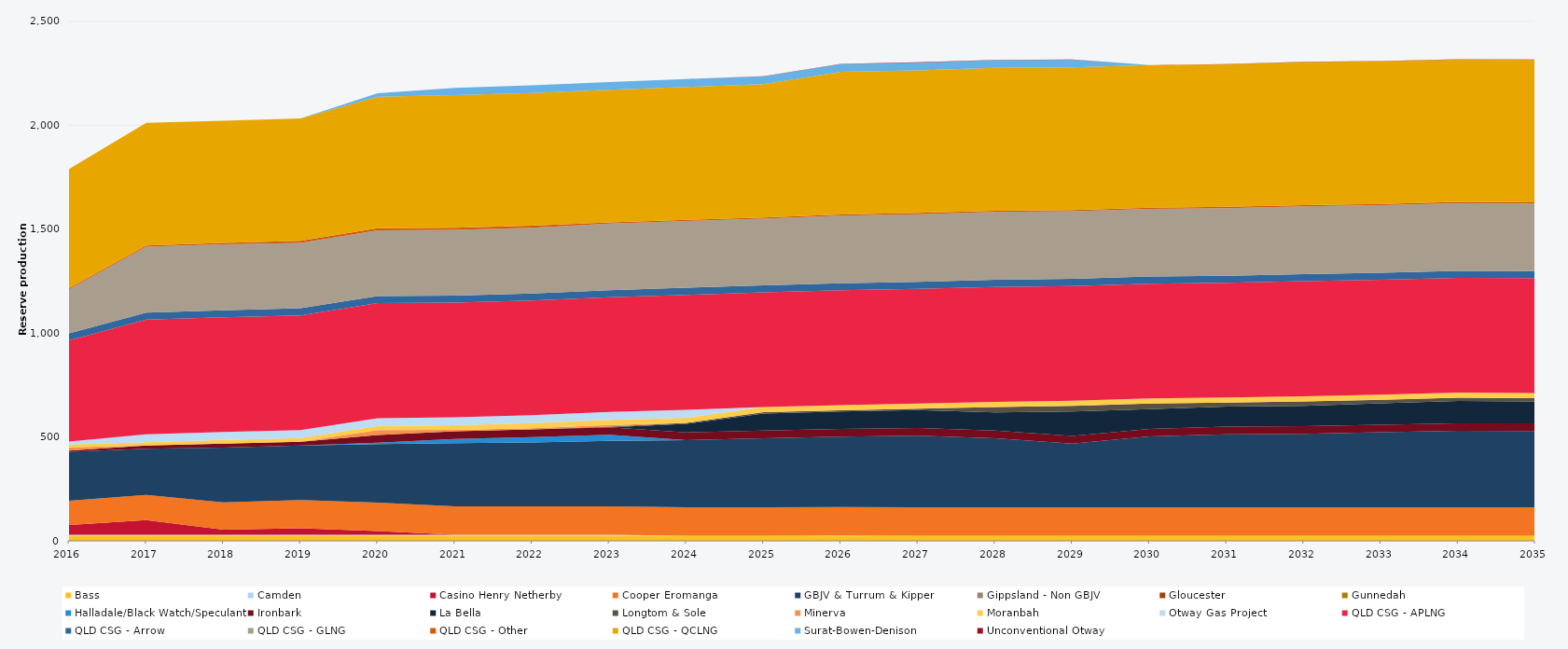
| Category | Bass | Camden | Casino Henry Netherby | Cooper Eromanga | GBJV & Turrum & Kipper | Gippsland - Non GBJV | Gloucester | Gunnedah | Halladale/Black Watch/Speculant | Ironbark | La Bella | Longtom & Sole | Minerva | Moranbah | Otway Gas Project | QLD CSG - APLNG | QLD CSG - Arrow | QLD CSG - GLNG | QLD CSG - Other | QLD CSG - QCLNG | Surat-Bowen-Denison | Unconventional Otway |
|---|---|---|---|---|---|---|---|---|---|---|---|---|---|---|---|---|---|---|---|---|---|---|
| 2016 | 24.522 | 5 | 46.481 | 117.302 | 235.041 | 0 | 0 | 0 | 0 | 5.468 | 0 | 0 | 16 | 13.144 | 15.606 | 486.482 | 34.038 | 211.563 | 5.856 | 573.742 | 0 | 0 |
| 2017 | 24.455 | 5 | 69.931 | 121.253 | 222.562 | 0 | 0 | 0 | 0 | 16.286 | 0 | 0 | 0 | 14.794 | 38 | 552.245 | 33.945 | 317.522 | 5.84 | 589.569 | 0 | 0 |
| 2018 | 24.455 | 5 | 24.61 | 130.904 | 264.315 | 0 | 0 | 0 | 0 | 18.209 | 0 | 0 | 0 | 17.995 | 38 | 552.245 | 33.945 | 318.073 | 5.84 | 588.744 | 0 | 0 |
| 2019 | 24.455 | 5 | 31.568 | 135.35 | 262.5 | 0 | 0 | 0 | 0 | 18.25 | 0 | 0 | 0 | 18.062 | 38 | 552.245 | 33.945 | 314.436 | 10.403 | 588.948 | 0 | 0 |
| 2020 | 24.522 | 5 | 17.669 | 137.25 | 281.351 | 0 | 0 | 0 | 6.818 | 36.6 | 0 | 0 | 23.79 | 19.632 | 38 | 553.758 | 34.038 | 315.784 | 10.419 | 633.458 | 16.42 | 0 |
| 2021 | 24.455 | 5 | 0 | 136.875 | 304.277 | 0 | 0 | 0 | 20.198 | 36.5 | 0 | 0 | 7.135 | 22.187 | 38 | 552.245 | 33.945 | 315.98 | 10.403 | 638.374 | 35.153 | 0 |
| 2022 | 24.455 | 5 | 0 | 136.875 | 306.648 | 0 | 0 | 0 | 26.339 | 36.5 | 0 | 0 | 6.283 | 24.144 | 38 | 552.245 | 33.945 | 316.418 | 10.403 | 638.383 | 37.23 | 0 |
| 2023 | 24.455 | 5 | 0 | 136.875 | 315.098 | 0 | 0 | 0 | 28.645 | 36.5 | 0 | 3.364 | 7.541 | 24.788 | 38 | 552.245 | 33.945 | 320.75 | 5.84 | 638.041 | 37.23 | 0 |
| 2024 | 24.522 | 0 | 0 | 137.25 | 323.245 | 0 | 0 | 0 | 0 | 36.6 | 42.142 | 3.84 | 0 | 24.888 | 38 | 553.758 | 34.038 | 321.243 | 5.856 | 639.813 | 37.332 | 0 |
| 2025 | 24.455 | 0 | 0 | 136.875 | 332.757 | 0 | 0 | 0 | 0 | 36.5 | 82.203 | 6.262 | 0 | 24.82 | 0 | 552.245 | 33.945 | 320.866 | 5.84 | 641.133 | 37.23 | 0.854 |
| 2026 | 24.455 | 1 | 0 | 136.875 | 339.537 | 0 | 0 | 0 | 0 | 36.5 | 84.04 | 6.381 | 0 | 24.82 | 0 | 552.245 | 33.945 | 325.58 | 5.84 | 686.2 | 37.23 | 0.883 |
| 2027 | 24.455 | 0 | 0 | 136.875 | 345.189 | 0 | 0 | 0 | 0 | 36.5 | 86.031 | 6.937 | 0 | 24.82 | 0 | 552.245 | 33.945 | 325.58 | 5.84 | 686.2 | 37.23 | 1.497 |
| 2028 | 24.522 | 0 | 0 | 137.25 | 332.301 | 0 | 0 | 0 | 0 | 36.6 | 88.107 | 24.931 | 0 | 24.888 | 0 | 553.758 | 34.038 | 326.472 | 5.856 | 688.08 | 37.332 | 0.878 |
| 2029 | 24.455 | 0 | 0 | 136.875 | 306.869 | 0 | 0 | 0 | 0 | 36.5 | 117.776 | 27.375 | 0 | 24.82 | 0 | 552.245 | 33.945 | 325.58 | 5.84 | 686.2 | 37.127 | 1.495 |
| 2030 | 24.455 | 0 | 0 | 136.875 | 341.19 | 0 | 0 | 0 | 0 | 36.5 | 94.742 | 27.375 | 0 | 24.82 | 0 | 552.245 | 33.945 | 325.58 | 5.84 | 686.2 | 0 | 0.507 |
| 2031 | 24.455 | 0 | 0 | 136.875 | 351.891 | 0 | 0 | 0 | 0 | 36.5 | 96.446 | 18.956 | 0 | 24.82 | 0 | 552.245 | 33.945 | 325.58 | 5.84 | 686.2 | 0 | 0.41 |
| 2032 | 24.522 | 0 | 0 | 137.25 | 353.692 | 0 | 0 | 0 | 0 | 36.6 | 98.152 | 21.12 | 0 | 24.888 | 0 | 553.758 | 34.038 | 326.472 | 5.856 | 688.08 | 0 | 1.258 |
| 2033 | 24.455 | 0 | 0 | 136.875 | 361.413 | 0 | 0 | 0 | 0 | 36.5 | 103.278 | 16.645 | 0 | 24.82 | 0 | 552.245 | 33.945 | 325.58 | 5.84 | 686.2 | 0 | 0.957 |
| 2034 | 24.455 | 0 | 0 | 136.875 | 368.025 | 0 | 0 | 0 | 0 | 36.5 | 107.761 | 15.064 | 0 | 24.82 | 0 | 552.245 | 33.945 | 325.58 | 5.84 | 686.2 | 0 | 1.243 |
| 2035 | 24.455 | 0 | 0 | 136.875 | 367.134 | 0 | 0 | 0 | 0 | 36.5 | 106.322 | 15.791 | 0 | 24.82 | 0 | 552.245 | 33.945 | 325.58 | 5.84 | 686.2 | 0 | 1.018 |